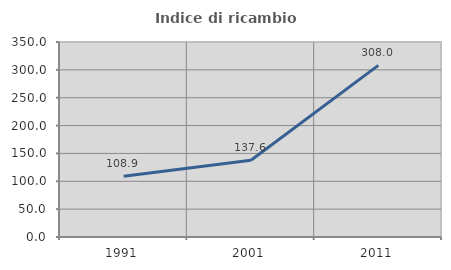
| Category | Indice di ricambio occupazionale  |
|---|---|
| 1991.0 | 108.929 |
| 2001.0 | 137.63 |
| 2011.0 | 307.987 |